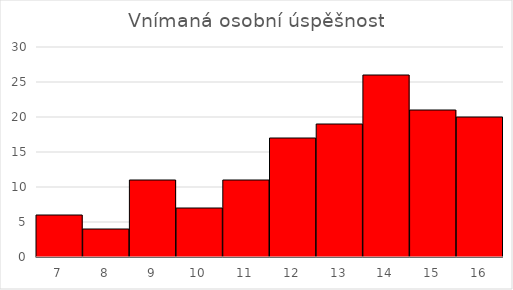
| Category | četnosti |
|---|---|
| 7.0 | 6 |
| 8.0 | 4 |
| 9.0 | 11 |
| 10.0 | 7 |
| 11.0 | 11 |
| 12.0 | 17 |
| 13.0 | 19 |
| 14.0 | 26 |
| 15.0 | 21 |
| 16.0 | 20 |